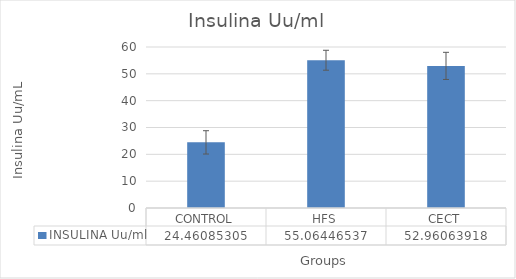
| Category | INSULINA Uu/ml |
|---|---|
| CONTROL | 24.461 |
| HFS | 55.064 |
| CECT | 52.961 |